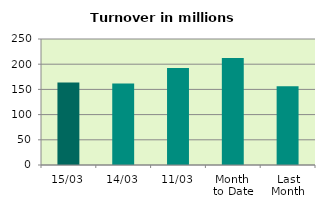
| Category | Series 0 |
|---|---|
| 15/03 | 163.688 |
| 14/03 | 161.646 |
| 11/03 | 192.462 |
| Month 
to Date | 212.502 |
| Last
Month | 156.222 |